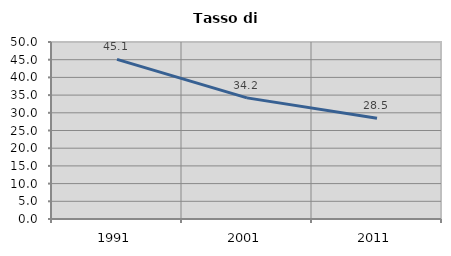
| Category | Tasso di disoccupazione   |
|---|---|
| 1991.0 | 45.101 |
| 2001.0 | 34.216 |
| 2011.0 | 28.467 |